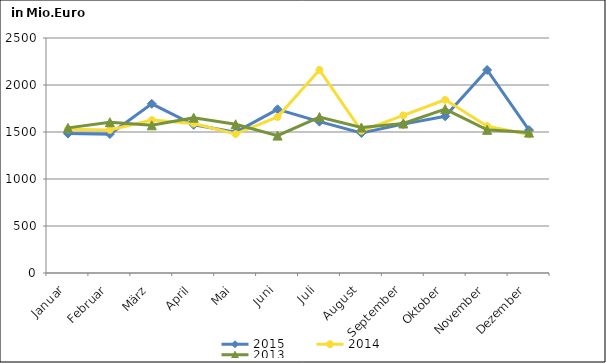
| Category | 2015 | 2014 | 2013 |
|---|---|---|---|
| Januar | 1483.329 | 1528.411 | 1543.949 |
| Februar | 1477.46 | 1522.527 | 1603.963 |
| März | 1800.029 | 1626.661 | 1571.45 |
| April | 1576.293 | 1589.917 | 1652.249 |
| Mai | 1498.124 | 1478.314 | 1581.875 |
| Juni | 1741.269 | 1659.563 | 1461.452 |
| Juli | 1610.203 | 2160.552 | 1659.178 |
| August | 1488.872 | 1512.039 | 1548.153 |
| September | 1583.92 | 1676.139 | 1590.452 |
| Oktober | 1666.689 | 1842.815 | 1744.21 |
| November | 2159.616 | 1561.962 | 1523.225 |
| Dezember | 1520.186 | 1473.459 | 1493.69 |